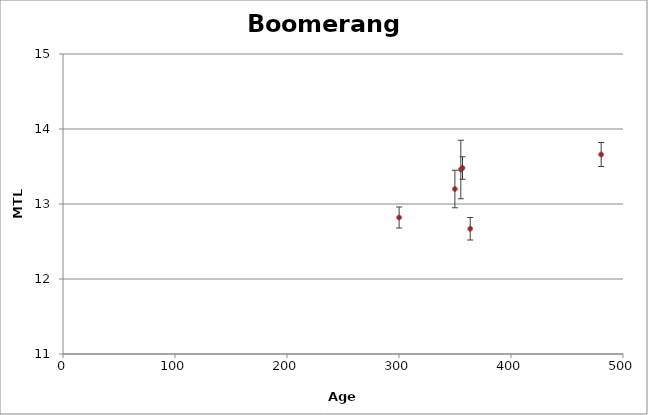
| Category | Boomerang Plot |
|---|---|
| 355.2 | 13.46 |
| 480.5 | 13.66 |
| 363.6 | 12.67 |
| 349.9 | 13.2 |
| 356.7 | 13.48 |
| 300.1 | 12.82 |